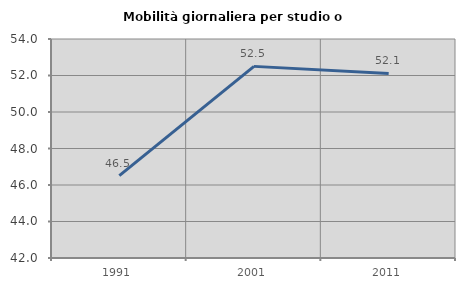
| Category | Mobilità giornaliera per studio o lavoro |
|---|---|
| 1991.0 | 46.512 |
| 2001.0 | 52.5 |
| 2011.0 | 52.113 |